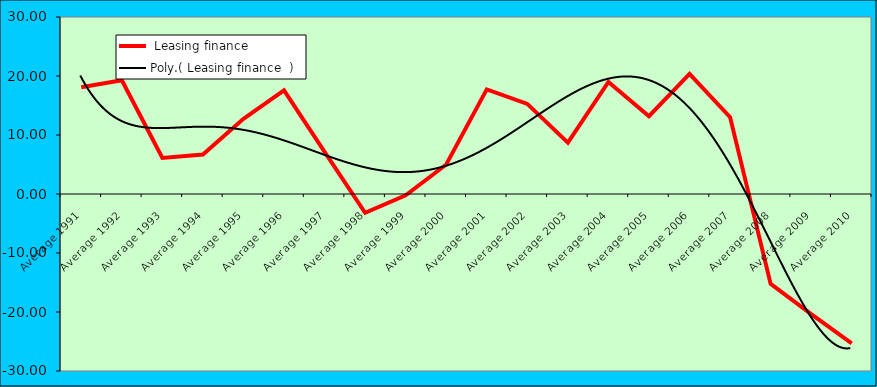
| Category |  Leasing finance   |
|---|---|
| Average 1991 | 18.097 |
| Average 1992 | 19.267 |
| Average 1993 | 6.122 |
| Average 1994 | 6.691 |
| Average 1995 | 12.754 |
| Average 1996 | 17.569 |
| Average 1997 | 7.149 |
| Average 1998 | -3.185 |
| Average 1999 | -0.21 |
| Average 2000 | 5.004 |
| Average 2001 | 17.725 |
| Average 2002 | 15.274 |
| Average 2003 | 8.693 |
| Average 2004 | 19.002 |
| Average 2005 | 13.186 |
| Average 2006 | 20.353 |
| Average 2007 | 13.027 |
| Average 2008 | -15.239 |
| Average 2009 | -20.369 |
| Average 2010 | -25.32 |